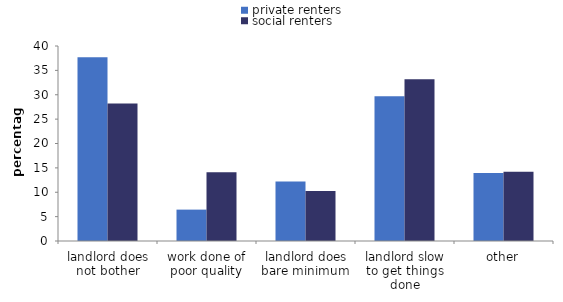
| Category | private renters | social renters |
|---|---|---|
| landlord does not bother | 37.711 | 28.22 |
| work done of poor quality | 6.438 | 14.124 |
| landlord does bare minimum | 12.2 | 10.268 |
| landlord slow to get things done | 29.69 | 33.196 |
| other | 13.961 | 14.192 |